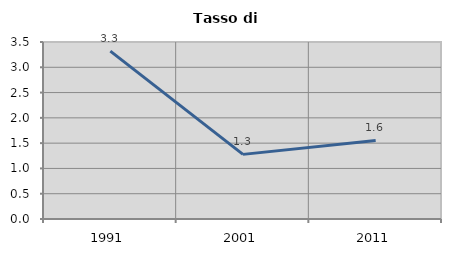
| Category | Tasso di disoccupazione   |
|---|---|
| 1991.0 | 3.32 |
| 2001.0 | 1.278 |
| 2011.0 | 1.554 |